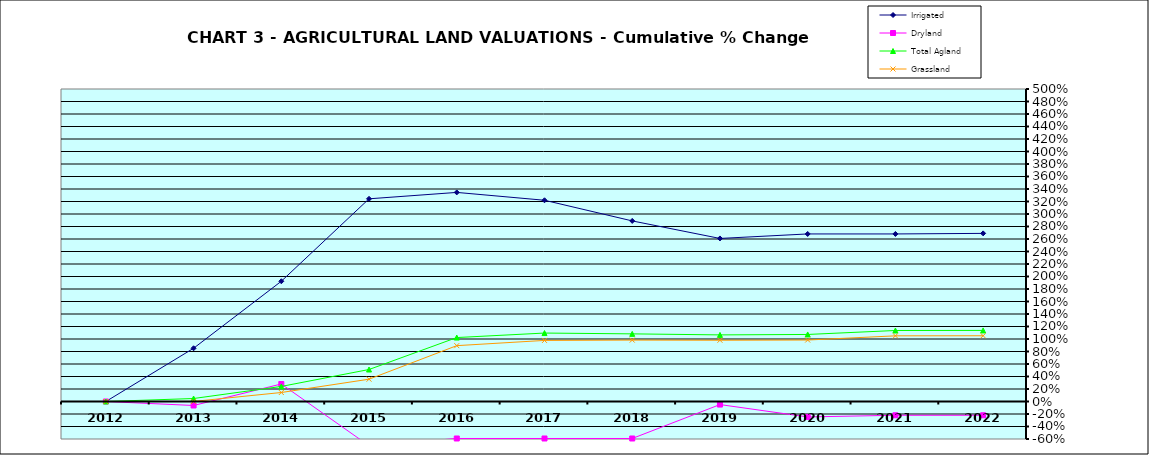
| Category | Irrigated | Dryland | Total Agland | Grassland |
|---|---|---|---|---|
| 2012.0 | 0 | 0 | 0 | 0 |
| 2013.0 | 0.852 | -0.064 | 0.048 | 0.001 |
| 2014.0 | 1.924 | 0.28 | 0.241 | 0.144 |
| 2015.0 | 3.243 | -0.708 | 0.512 | 0.357 |
| 2016.0 | 3.345 | -0.592 | 1.023 | 0.894 |
| 2017.0 | 3.22 | -0.592 | 1.095 | 0.977 |
| 2018.0 | 2.889 | -0.592 | 1.082 | 0.983 |
| 2019.0 | 2.609 | -0.049 | 1.066 | 0.98 |
| 2020.0 | 2.681 | -0.247 | 1.073 | 0.984 |
| 2021.0 | 2.681 | -0.22 | 1.136 | 1.051 |
| 2022.0 | 2.69 | -0.22 | 1.137 | 1.052 |